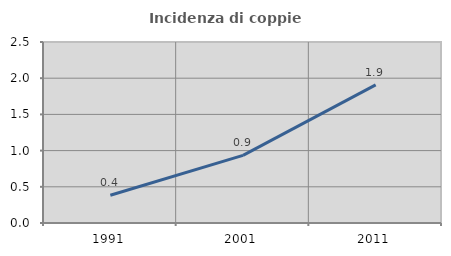
| Category | Incidenza di coppie miste |
|---|---|
| 1991.0 | 0.384 |
| 2001.0 | 0.933 |
| 2011.0 | 1.907 |